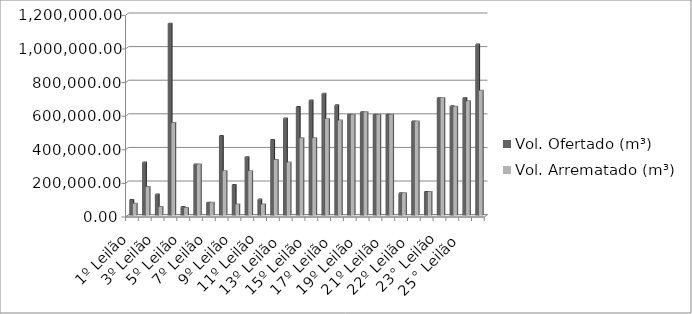
| Category | Vol. Ofertado (m³) | Vol. Arrematado (m³) |
|---|---|---|
| 1º Leilão | 92500 | 70000 |
| 2º Leilão | 315520 | 170000 |
| 3º Leilão | 125400 | 50000 |
| 4º Leilão | 1141335 | 550000 |
| 5º Leilão | 50000 | 45000 |
| 6º Leilão | 304000 | 304000 |
| 7º Leilão | 76000 | 76000 |
| 8º Leilão | 473140 | 264000 |
| 9º Leilão | 181810 | 66000 |
| 10º Leilão | 347060 | 264000 |
| 11º Leilão | 94760 | 66000 |
| 12º Leilão  | 449890 | 330000 |
| 13º Leilão  | 578152 | 315000 |
| 14º Leilão  | 645624 | 460000 |
| 15º Leilão  | 684931 | 460000 |
| 16º Leilão  | 725179 | 575000 |
| 17º Leilão  | 656000 | 565000 |
| 18º Leilão  | 600000 | 600000 |
| 19º Leilão  | 615000 | 615000 |
| 20º Leilão  | 600000 | 600000 |
| 21º Leilão  | 600000 | 600000 |
| 21º Leilão  | 132000 | 132000 |
| 22º Leilão  | 560000 | 560000 |
| 22º Leilão  | 140000 | 140000 |
| 23° Leilão | 700000 | 700000 |
| 24° Leilão  | 650000 | 647000 |
| 25° Leilão  | 700000 | 679400 |
| 26° Leilão | 1017500 | 742439 |